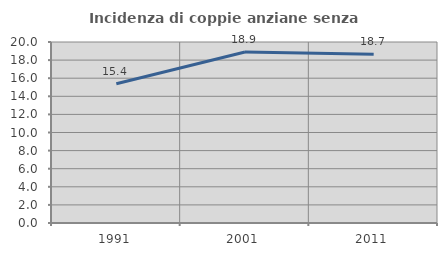
| Category | Incidenza di coppie anziane senza figli  |
|---|---|
| 1991.0 | 15.385 |
| 2001.0 | 18.898 |
| 2011.0 | 18.653 |